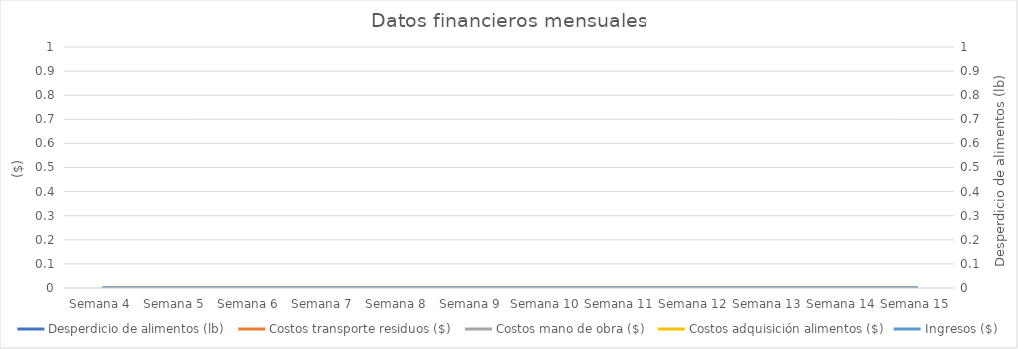
| Category | Desperdicio de alimentos (lb)  | Costos transporte residuos ($)  | Costos mano de obra ($)  | Costos adquisición alimentos ($) |
|---|---|---|---|---|
| Semana 4 | 0 | 0 | 0 | 0 |
| Semana 5 | 0 | 0 | 0 | 0 |
| Semana 6 | 0 | 0 | 0 | 0 |
| Semana 7 | 0 | 0 | 0 | 0 |
| Semana 8 | 0 | 0 | 0 | 0 |
| Semana 9 | 0 | 0 | 0 | 0 |
| Semana 10 | 0 | 0 | 0 | 0 |
| Semana 11 | 0 | 0 | 0 | 0 |
| Semana 12 | 0 | 0 | 0 | 0 |
| Semana 13 | 0 | 0 | 0 | 0 |
| Semana 14 | 0 | 0 | 0 | 0 |
| Semana 15 | 0 | 0 | 0 | 0 |